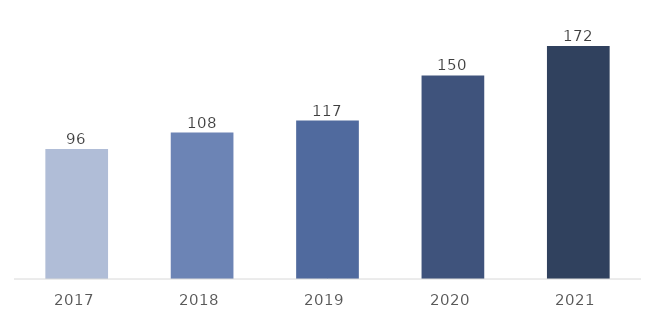
| Category | Total |
|---|---|
| 2017 | 95.908 |
| 2018 | 108.106 |
| 2019 | 116.953 |
| 2020 | 150.225 |
| 2021 | 171.922 |